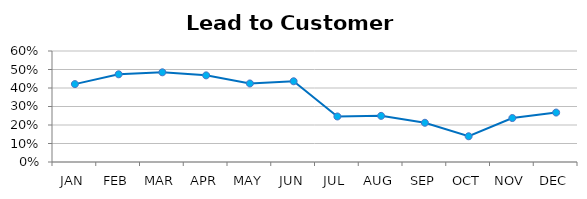
| Category | Lead to Customer % |
|---|---|
| JAN | 0.421 |
| FEB | 0.474 |
| MAR | 0.485 |
| APR | 0.468 |
| MAY | 0.424 |
| JUN | 0.436 |
| JUL | 0.246 |
| AUG | 0.249 |
| SEP | 0.212 |
| OCT | 0.139 |
| NOV | 0.238 |
| DEC | 0.267 |